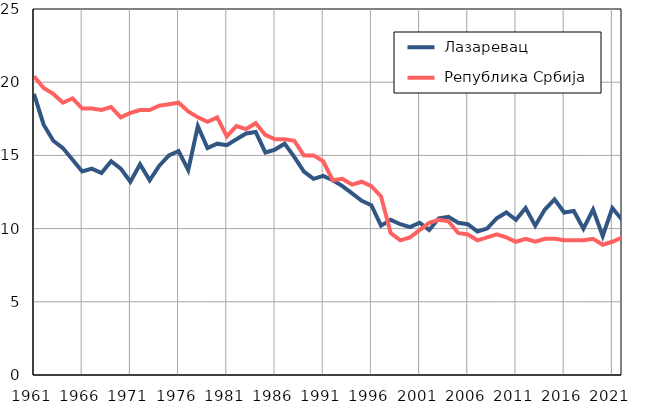
| Category |  Лазаревац |  Република Србија |
|---|---|---|
| 1961.0 | 19.2 | 20.4 |
| 1962.0 | 17.1 | 19.6 |
| 1963.0 | 16 | 19.2 |
| 1964.0 | 15.5 | 18.6 |
| 1965.0 | 14.7 | 18.9 |
| 1966.0 | 13.9 | 18.2 |
| 1967.0 | 14.1 | 18.2 |
| 1968.0 | 13.8 | 18.1 |
| 1969.0 | 14.6 | 18.3 |
| 1970.0 | 14.1 | 17.6 |
| 1971.0 | 13.2 | 17.9 |
| 1972.0 | 14.4 | 18.1 |
| 1973.0 | 13.3 | 18.1 |
| 1974.0 | 14.3 | 18.4 |
| 1975.0 | 15 | 18.5 |
| 1976.0 | 15.3 | 18.6 |
| 1977.0 | 14 | 18 |
| 1978.0 | 17 | 17.6 |
| 1979.0 | 15.5 | 17.3 |
| 1980.0 | 15.8 | 17.6 |
| 1981.0 | 15.7 | 16.3 |
| 1982.0 | 16.1 | 17 |
| 1983.0 | 16.5 | 16.8 |
| 1984.0 | 16.6 | 17.2 |
| 1985.0 | 15.2 | 16.4 |
| 1986.0 | 15.4 | 16.1 |
| 1987.0 | 15.8 | 16.1 |
| 1988.0 | 14.9 | 16 |
| 1989.0 | 13.9 | 15 |
| 1990.0 | 13.4 | 15 |
| 1991.0 | 13.6 | 14.6 |
| 1992.0 | 13.3 | 13.3 |
| 1993.0 | 12.9 | 13.4 |
| 1994.0 | 12.4 | 13 |
| 1995.0 | 11.9 | 13.2 |
| 1996.0 | 11.6 | 12.9 |
| 1997.0 | 10.2 | 12.2 |
| 1998.0 | 10.6 | 9.7 |
| 1999.0 | 10.3 | 9.2 |
| 2000.0 | 10.1 | 9.4 |
| 2001.0 | 10.4 | 9.9 |
| 2002.0 | 9.9 | 10.4 |
| 2003.0 | 10.7 | 10.6 |
| 2004.0 | 10.8 | 10.5 |
| 2005.0 | 10.4 | 9.7 |
| 2006.0 | 10.3 | 9.6 |
| 2007.0 | 9.8 | 9.2 |
| 2008.0 | 10 | 9.4 |
| 2009.0 | 10.7 | 9.6 |
| 2010.0 | 11.1 | 9.4 |
| 2011.0 | 10.6 | 9.1 |
| 2012.0 | 11.4 | 9.3 |
| 2013.0 | 10.2 | 9.1 |
| 2014.0 | 11.3 | 9.3 |
| 2015.0 | 12 | 9.3 |
| 2016.0 | 11.1 | 9.2 |
| 2017.0 | 11.2 | 9.2 |
| 2018.0 | 10 | 9.2 |
| 2019.0 | 11.3 | 9.3 |
| 2020.0 | 9.5 | 8.9 |
| 2021.0 | 11.4 | 9.1 |
| 2022.0 | 10.6 | 9.4 |